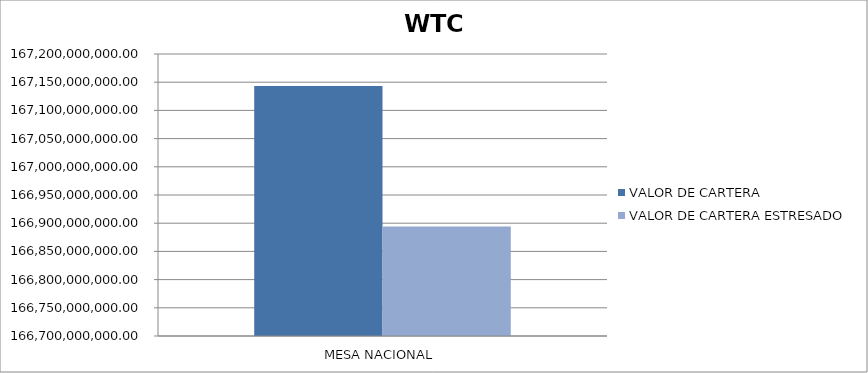
| Category | VALOR DE CARTERA | VALOR DE CARTERA ESTRESADO |
|---|---|---|
| MESA NACIONAL | 167143179737.301 | 166894054950.111 |